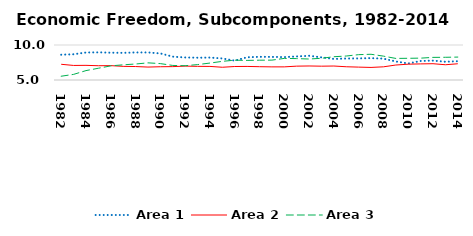
| Category | Area 1 | Area 2 | Area 3 |
|---|---|---|---|
| 1982.0 | 8.61 | 7.244 | 5.54 |
| 1983.0 | 8.679 | 7.078 | 5.802 |
| 1984.0 | 8.925 | 7.093 | 6.342 |
| 1985.0 | 8.953 | 7.039 | 6.681 |
| 1986.0 | 8.903 | 7.052 | 7.019 |
| 1987.0 | 8.881 | 6.946 | 7.168 |
| 1988.0 | 8.934 | 6.922 | 7.285 |
| 1989.0 | 8.93 | 6.847 | 7.449 |
| 1990.0 | 8.8 | 6.893 | 7.343 |
| 1991.0 | 8.337 | 6.913 | 7.079 |
| 1992.0 | 8.221 | 6.984 | 7.041 |
| 1993.0 | 8.182 | 6.949 | 7.201 |
| 1994.0 | 8.206 | 6.941 | 7.42 |
| 1995.0 | 8.078 | 6.82 | 7.664 |
| 1996.0 | 7.767 | 6.928 | 7.833 |
| 1997.0 | 8.245 | 6.938 | 7.798 |
| 1998.0 | 8.315 | 6.9 | 7.83 |
| 1999.0 | 8.299 | 6.877 | 7.838 |
| 2000.0 | 8.272 | 6.876 | 8.085 |
| 2001.0 | 8.366 | 6.979 | 8.056 |
| 2002.0 | 8.461 | 7.003 | 7.996 |
| 2003.0 | 8.234 | 6.974 | 8.103 |
| 2004.0 | 8.007 | 6.997 | 8.326 |
| 2005.0 | 8.072 | 6.891 | 8.426 |
| 2006.0 | 8.082 | 6.841 | 8.622 |
| 2007.0 | 8.128 | 6.795 | 8.675 |
| 2008.0 | 8.049 | 6.883 | 8.409 |
| 2009.0 | 7.648 | 7.138 | 8.082 |
| 2010.0 | 7.364 | 7.259 | 8.101 |
| 2011.0 | 7.714 | 7.3 | 8.123 |
| 2012.0 | 7.77 | 7.327 | 8.232 |
| 2013.0 | 7.611 | 7.177 | 8.244 |
| 2014.0 | 7.687 | 7.32 | 8.274 |